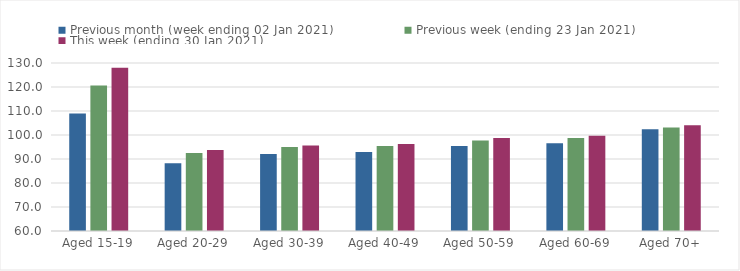
| Category | Previous month (week ending 02 Jan 2021) | Previous week (ending 23 Jan 2021) | This week (ending 30 Jan 2021) |
|---|---|---|---|
| Aged 15-19 | 108.97 | 120.59 | 127.99 |
| Aged 20-29 | 88.21 | 92.53 | 93.73 |
| Aged 30-39 | 92.05 | 94.98 | 95.6 |
| Aged 40-49 | 92.93 | 95.4 | 96.26 |
| Aged 50-59 | 95.38 | 97.74 | 98.7 |
| Aged 60-69 | 96.56 | 98.71 | 99.69 |
| Aged 70+ | 102.44 | 103.17 | 104.1 |